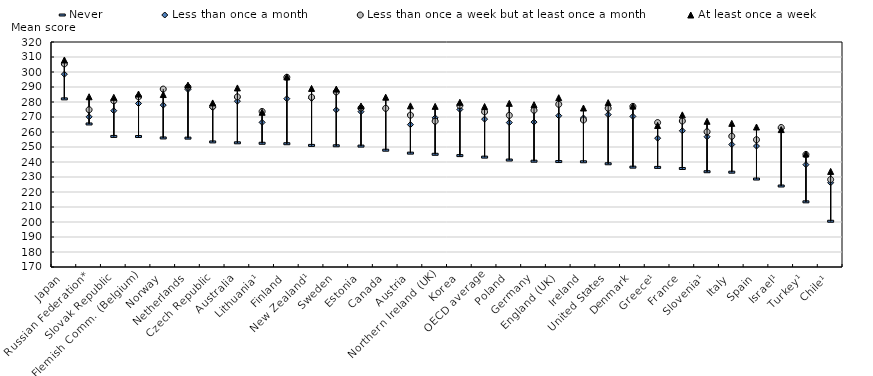
| Category | Never  | Less than once a month | Less than once a week but at least once a month | At least once a week |
|---|---|---|---|---|
| Japan | 282.093 | 298.552 | 305.451 | 308.02 |
| Russian Federation* | 265.362 | 270.13 | 274.835 | 283.486 |
| Slovak Republic | 257.049 | 274.2 | 280.844 | 283.124 |
| Flemish Comm. (Belgium) | 256.989 | 279.019 | 283.436 | 285.323 |
| Norway | 256.041 | 277.934 | 288.615 | 284.965 |
| Netherlands | 255.917 | 288.366 | 289.943 | 291.273 |
| Czech Republic | 253.391 | 276.281 | 277.092 | 279.377 |
| Australia | 252.793 | 280.553 | 283.433 | 289.381 |
| Lithuania¹ | 252.481 | 266.407 | 273.684 | 273.155 |
| Finland | 252.178 | 282.198 | 296.467 | 296.72 |
| New Zealand¹ | 251.065 | 282.545 | 283.179 | 289.057 |
| Sweden | 250.816 | 274.705 | 286.722 | 288.626 |
| Estonia | 250.596 | 273.547 | 275.962 | 277.343 |
| Canada | 247.865 | 275.832 | 275.763 | 283.211 |
| Austria | 245.91 | 264.9 | 271.223 | 277.437 |
| Northern Ireland (UK) | 245.138 | 269.432 | 267.224 | 277.1 |
| Korea | 244.264 | 275.044 | 277.641 | 279.787 |
| OECD average | 243.255 | 268.579 | 273.458 | 276.989 |
| Poland | 241.315 | 266.276 | 271.111 | 279.108 |
| Germany | 240.537 | 266.614 | 274.508 | 278.217 |
| England (UK) | 240.294 | 270.847 | 278.47 | 282.866 |
| Ireland | 240.148 | 269.349 | 268.002 | 275.986 |
| United States | 238.816 | 271.59 | 275.838 | 279.602 |
| Denmark | 236.572 | 270.4 | 277.076 | 277.295 |
| Greece¹ | 236.403 | 255.881 | 266.282 | 264.36 |
| France | 235.675 | 260.816 | 267.342 | 271.427 |
| Slovenia¹ | 233.517 | 256.849 | 260.127 | 267.143 |
| Italy | 233.218 | 251.662 | 257.189 | 265.758 |
| Spain | 228.637 | 250.63 | 254.857 | 263.318 |
| Israel¹ | 223.994 | 262.551 | 262.991 | 261.606 |
| Turkey¹ | 213.442 | 238.22 | 244.973 | 245.345 |
| Chile¹ | 200.493 | 226.181 | 228.289 | 233.729 |